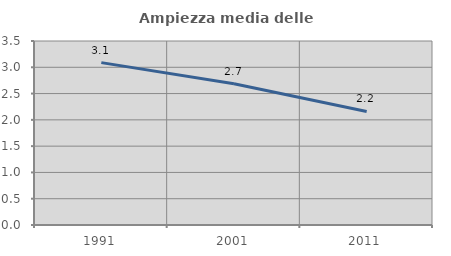
| Category | Ampiezza media delle famiglie |
|---|---|
| 1991.0 | 3.089 |
| 2001.0 | 2.687 |
| 2011.0 | 2.159 |